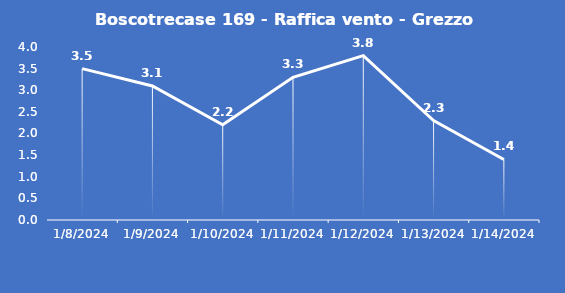
| Category | Boscotrecase 169 - Raffica vento - Grezzo (m/s) |
|---|---|
| 1/8/24 | 3.5 |
| 1/9/24 | 3.1 |
| 1/10/24 | 2.2 |
| 1/11/24 | 3.3 |
| 1/12/24 | 3.8 |
| 1/13/24 | 2.3 |
| 1/14/24 | 1.4 |